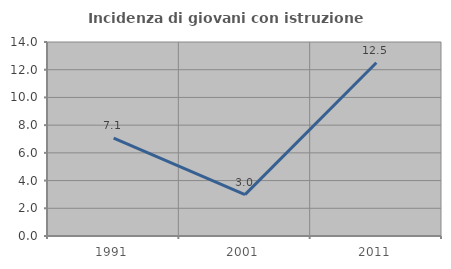
| Category | Incidenza di giovani con istruzione universitaria |
|---|---|
| 1991.0 | 7.059 |
| 2001.0 | 2.985 |
| 2011.0 | 12.5 |